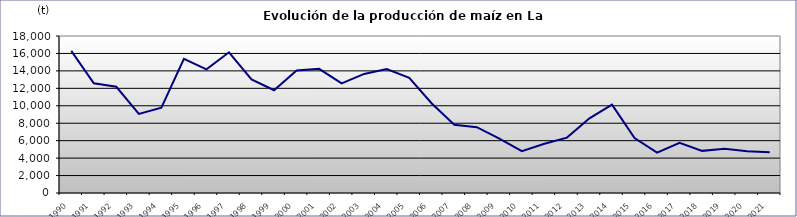
| Category | Grano |
|---|---|
| 1990.0 | 16300 |
| 1991.0 | 12586 |
| 1992.0 | 12177 |
| 1993.0 | 9067 |
| 1994.0 | 9786 |
| 1995.0 | 15394 |
| 1996.0 | 14177 |
| 1997.0 | 16130 |
| 1998.0 | 13020 |
| 1999.0 | 11783 |
| 2000.0 | 14045.4 |
| 2001.0 | 14237 |
| 2002.0 | 12574 |
| 2003.0 | 13653 |
| 2004.0 | 14219 |
| 2005.0 | 13205 |
| 2006.0 | 10262 |
| 2007.0 | 7829 |
| 2008.0 | 7551 |
| 2009.0 | 6247 |
| 2010.0 | 4803 |
| 2011.0 | 5643 |
| 2012.0 | 6348 |
| 2013.0 | 8563 |
| 2014.0 | 10126 |
| 2015.0 | 6297 |
| 2016.0 | 4620 |
| 2017.0 | 5746 |
| 2018.0 | 4831 |
| 2019.0 | 5070 |
| 2020.0 | 4793 |
| 2021.0 | 4677 |